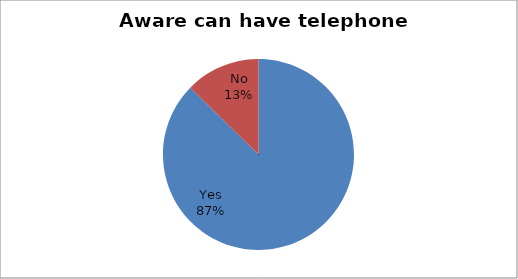
| Category | Series 0 |
|---|---|
| Yes | 324 |
| No | 47 |